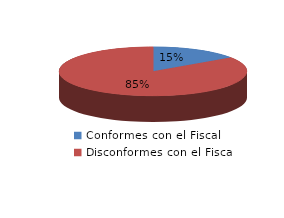
| Category | Series 0 |
|---|---|
| 0 | 4 |
| 1 | 22 |